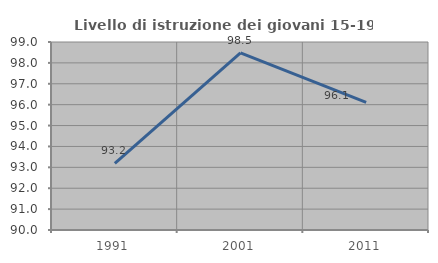
| Category | Livello di istruzione dei giovani 15-19 anni |
|---|---|
| 1991.0 | 93.195 |
| 2001.0 | 98.479 |
| 2011.0 | 96.109 |